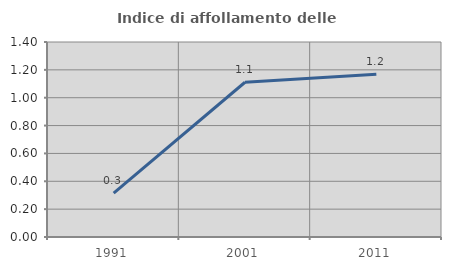
| Category | Indice di affollamento delle abitazioni  |
|---|---|
| 1991.0 | 0.315 |
| 2001.0 | 1.111 |
| 2011.0 | 1.168 |